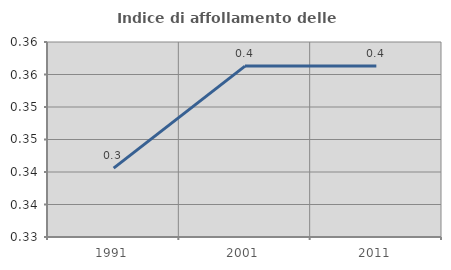
| Category | Indice di affollamento delle abitazioni  |
|---|---|
| 1991.0 | 0.341 |
| 2001.0 | 0.356 |
| 2011.0 | 0.356 |